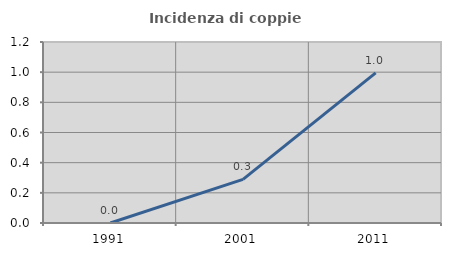
| Category | Incidenza di coppie miste |
|---|---|
| 1991.0 | 0 |
| 2001.0 | 0.289 |
| 2011.0 | 0.995 |